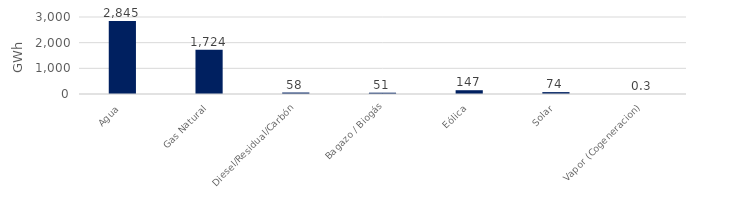
| Category | Series 0 |
|---|---|
| Agua | 2845.429 |
| Gas Natural | 1723.518 |
| Diesel/Residual/Carbón | 57.697 |
| Bagazo / Biogás | 51.329 |
| Eólica | 147.328 |
| Solar | 73.657 |
| Vapor (Cogeneracion) | 0.259 |